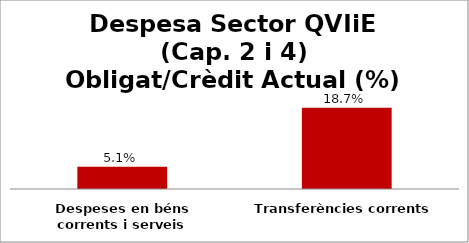
| Category | Series 0 |
|---|---|
| Despeses en béns corrents i serveis | 0.051 |
| Transferències corrents | 0.187 |